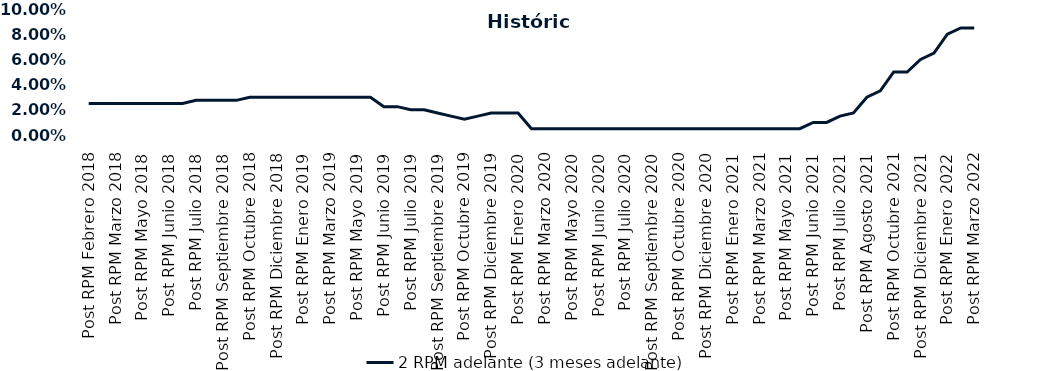
| Category | 2 RPM adelante (3 meses adelante) |
|---|---|
| Post RPM Febrero 2018 | 0.025 |
| Pre RPM Marzo 2018 | 0.025 |
| Post RPM Marzo 2018 | 0.025 |
| Pre RPM Mayo 2018 | 0.025 |
| Post RPM Mayo 2018 | 0.025 |
| Pre RPM Junio 2018 | 0.025 |
| Post RPM Junio 2018 | 0.025 |
| Pre RPM Julio 2018 | 0.025 |
| Post RPM Julio 2018 | 0.028 |
| Pre RPM Septiembre 2018 | 0.028 |
| Post RPM Septiembre 2018 | 0.028 |
| Pre RPM Octubre 2018 | 0.028 |
| Post RPM Octubre 2018 | 0.03 |
| Pre RPM Diciembre 2018 | 0.03 |
| Post RPM Diciembre 2018 | 0.03 |
| Pre RPM Enero 2019 | 0.03 |
| Post RPM Enero 2019 | 0.03 |
| Pre RPM Marzo 2019 | 0.03 |
| Post RPM Marzo 2019 | 0.03 |
| Pre RPM Mayo 2019 | 0.03 |
| Post RPM Mayo 2019 | 0.03 |
| Pre RPM Junio 2019 | 0.03 |
| Post RPM Junio 2019 | 0.022 |
| Pre RPM Julio 2019 | 0.022 |
| Post RPM Julio 2019 | 0.02 |
| Pre RPM Septiembre 2019 | 0.02 |
| Post RPM Septiembre 2019 | 0.018 |
| Pre RPM Octubre 2019 | 0.015 |
| Post RPM Octubre 2019 | 0.012 |
| Pre RPM Diciembre 2019 | 0.015 |
| Post RPM Diciembre 2019 | 0.018 |
| Pre RPM Enero 2020 | 0.018 |
| Post RPM Enero 2020 | 0.018 |
| Pre RPM Marzo 2020 | 0.005 |
| Post RPM Marzo 2020 | 0.005 |
| Pre RPM Mayo 2020 | 0.005 |
| Post RPM Mayo 2020 | 0.005 |
| Pre RPM Junio 2020 | 0.005 |
| Post RPM Junio 2020 | 0.005 |
| Pre RPM Julio 2020 | 0.005 |
| Post RPM Julio 2020 | 0.005 |
| Pre RPM Septiembre 2020 | 0.005 |
| Post RPM Septiembre 2020 | 0.005 |
| Pre RPM Octubre 2020 | 0.005 |
| Post RPM Octubre 2020 | 0.005 |
| Pre RPM Diciembre 2020 | 0.005 |
| Post RPM Diciembre 2020 | 0.005 |
| Pre RPM Enero 2021 | 0.005 |
| Post RPM Enero 2021 | 0.005 |
| Pre RPM Marzo 2021 | 0.005 |
| Post RPM Marzo 2021 | 0.005 |
| Pre RPM Mayo 2021 | 0.005 |
| Post RPM Mayo 2021 | 0.005 |
| Pre RPM Junio 2021 | 0.005 |
| Post RPM Junio 2021 | 0.01 |
| Pre RPM Julio 2021 | 0.01 |
| Post RPM Julio 2021 | 0.015 |
| Pre RPM Agosto 2021 | 0.018 |
| Post RPM Agosto 2021 | 0.03 |
| Pre RPM Octubre 2021 | 0.035 |
| Post RPM Octubre 2021 | 0.05 |
| Pre RPM Diciembre 2021 | 0.05 |
| Post RPM Diciembre 2021 | 0.06 |
| Pre RPM Enero 2022 | 0.065 |
| Post RPM Enero 2022 | 0.08 |
| Pre RPM Marzo 2022 | 0.085 |
| Post RPM Marzo 2022 | 0.085 |